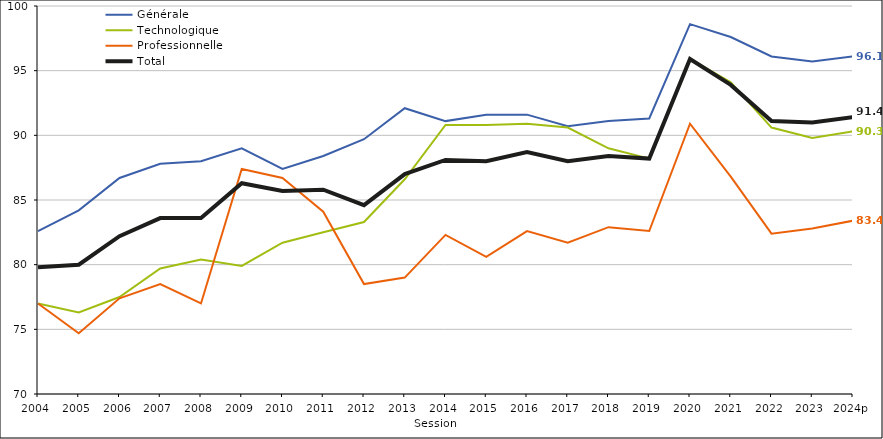
| Category | Générale | Technologique | Professionnelle | Total |
|---|---|---|---|---|
| 2004 | 82.6 | 77 | 77 | 79.8 |
| 2005 | 84.2 | 76.3 | 74.7 | 80 |
| 2006 | 86.7 | 77.5 | 77.4 | 82.2 |
| 2007 | 87.8 | 79.7 | 78.5 | 83.6 |
| 2008 | 88 | 80.4 | 77 | 83.6 |
| 2009 | 89 | 79.9 | 87.4 | 86.3 |
| 2010 | 87.4 | 81.7 | 86.7 | 85.7 |
| 2011 | 88.4 | 82.5 | 84.1 | 85.8 |
| 2012 | 89.7 | 83.3 | 78.5 | 84.6 |
| 2013 | 92.1 | 86.6 | 79 | 87 |
| 2014 | 91.1 | 90.8 | 82.3 | 88.1 |
| 2015 | 91.6 | 90.8 | 80.6 | 88 |
| 2016 | 91.6 | 90.9 | 82.6 | 88.7 |
| 2017 | 90.7 | 90.6 | 81.7 | 88 |
| 2018 | 91.1 | 89 | 82.9 | 88.4 |
| 2019 | 91.3 | 88.2 | 82.6 | 88.2 |
| 2020 | 98.6 | 95.9 | 90.9 | 95.9 |
| 2021 | 97.6 | 94.1 | 86.8 | 93.9 |
| 2022 | 96.1 | 90.6 | 82.4 | 91.1 |
| 2023 | 95.7 | 89.8 | 82.8 | 91 |
| 2024p | 96.1 | 90.3 | 83.4 | 91.4 |